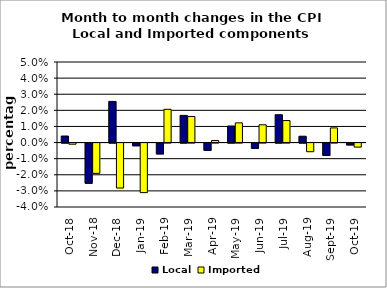
| Category | Local | Imported |
|---|---|---|
| 2018-10-01 | 0.004 | -0.001 |
| 2018-11-01 | -0.025 | -0.019 |
| 2018-12-01 | 0.026 | -0.028 |
| 2019-01-01 | -0.002 | -0.031 |
| 2019-02-01 | -0.007 | 0.021 |
| 2019-03-01 | 0.017 | 0.016 |
| 2019-04-01 | -0.005 | 0.001 |
| 2019-05-01 | 0.01 | 0.012 |
| 2019-06-01 | -0.003 | 0.011 |
| 2019-07-01 | 0.017 | 0.014 |
| 2019-08-01 | 0.004 | -0.005 |
| 2019-09-01 | -0.008 | 0.009 |
| 2019-10-01 | -0.001 | -0.003 |